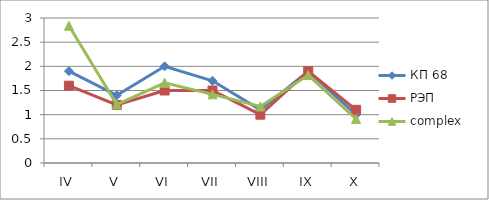
| Category | КП 68 | РЭП  | complex |
|---|---|---|---|
| IV | 1.9 | 1.6 | 2.84 |
| V | 1.4 | 1.2 | 1.21 |
| VI | 2 | 1.5 | 1.66 |
| VII | 1.7 | 1.5 | 1.42 |
| VIII | 1.1 | 1 | 1.17 |
| IX | 1.9 | 1.9 | 1.82 |
| X | 1 | 1.1 | 0.91 |